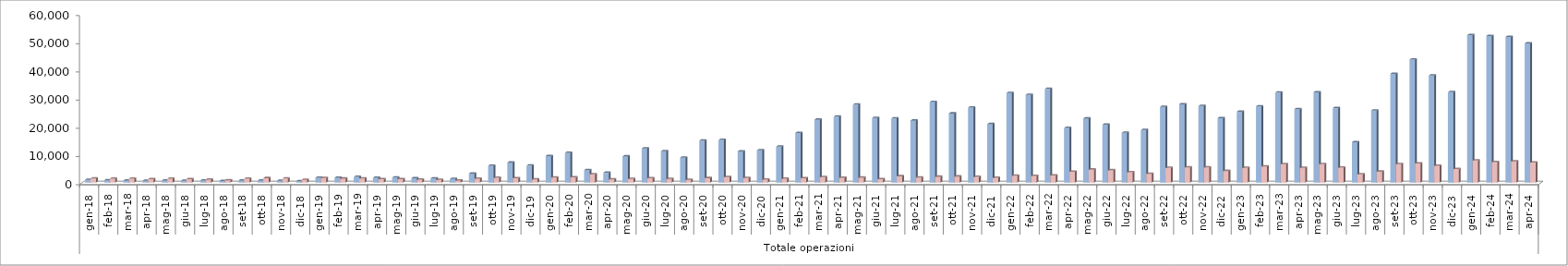
| Category | Series 0 | Series 1 |
|---|---|---|
| 0 | 996 | 1463 |
| 1 | 849 | 1374 |
| 2 | 765 | 1415 |
| 3 | 668 | 1245 |
| 4 | 737 | 1382 |
| 5 | 673 | 1258 |
| 6 | 732 | 1099 |
| 7 | 570 | 843 |
| 8 | 752 | 1388 |
| 9 | 752 | 1594 |
| 10 | 648 | 1454 |
| 11 | 466 | 1005 |
| 12 | 1741 | 1625 |
| 13 | 1745 | 1430 |
| 14 | 2021 | 1484 |
| 15 | 1730 | 1196 |
| 16 | 1790 | 1232 |
| 17 | 1559 | 1076 |
| 18 | 1484 | 963 |
| 19 | 1293 | 755 |
| 20 | 3217 | 1400 |
| 21 | 5987 | 1697 |
| 22 | 7090 | 1587 |
| 23 | 6030 | 1131 |
| 24 | 9451 | 1801 |
| 25 | 10561 | 1874 |
| 26 | 4442 | 2963 |
| 27 | 3496 | 1154 |
| 28 | 9296 | 1282 |
| 29 | 12120 | 1525 |
| 30 | 11135 | 1297 |
| 31 | 8877 | 955 |
| 32 | 14903 | 1592 |
| 33 | 15123 | 1971 |
| 34 | 11075 | 1637 |
| 35 | 11456 | 1038 |
| 36 | 12756 | 1373 |
| 37 | 17612 | 1579 |
| 38 | 22323 | 1951 |
| 39 | 23401 | 1754 |
| 40 | 27652 | 1762 |
| 41 | 22918 | 1212 |
| 42 | 22750 | 2248 |
| 43 | 21988 | 1811 |
| 44 | 28587 | 2089 |
| 45 | 24526 | 2173 |
| 46 | 26608 | 2017 |
| 47 | 20755 | 1690 |
| 48 | 31777 | 2455 |
| 49 | 31128 | 2403 |
| 50 | 33234 | 2539 |
| 51 | 19395 | 3881 |
| 52 | 22731 | 4626 |
| 53 | 20543 | 4376 |
| 54 | 17657 | 3675 |
| 55 | 18639 | 3129 |
| 56 | 26870 | 5225 |
| 57 | 27796 | 5426 |
| 58 | 27163 | 5403 |
| 59 | 22847 | 4132 |
| 60 | 25133 | 5222 |
| 61 | 27034 | 5742 |
| 62 | 31908 | 6560 |
| 63 | 26073 | 5242 |
| 64 | 32052 | 6534 |
| 65 | 26434 | 5320 |
| 66 | 14356 | 2917 |
| 67 | 25574 | 3894 |
| 68 | 38589 | 6540 |
| 69 | 43658 | 6792 |
| 70 | 37985 | 5985 |
| 71 | 32076 | 4809 |
| 72 | 52292 | 7834 |
| 73 | 52030 | 7318 |
| 74 | 51663 | 7564 |
| 75 | 49368 | 7094 |